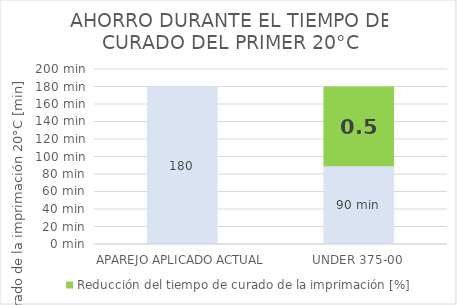
| Category | Tiempo de curado de la imprimación 20°C [min] | Reducción del tiempo de curado de la imprimación [%] |
|---|---|---|
| APAREJO APLICADO ACTUAL | 180 | 0 |
| UNDER 375-00 | 90 | 90 |